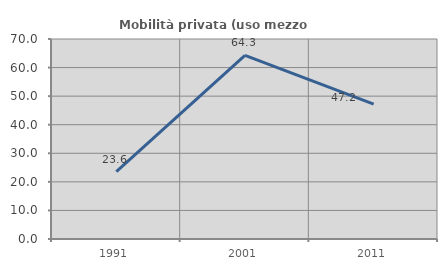
| Category | Mobilità privata (uso mezzo privato) |
|---|---|
| 1991.0 | 23.596 |
| 2001.0 | 64.286 |
| 2011.0 | 47.222 |